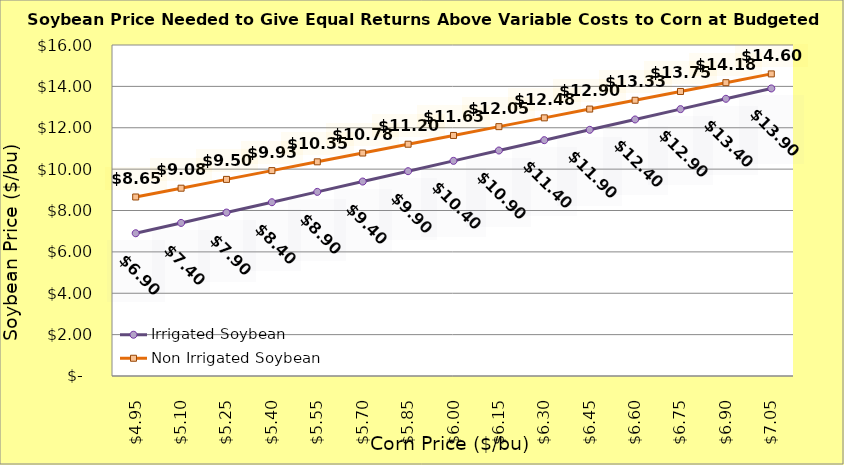
| Category | Irrigated Soybean | Non Irrigated Soybean |
|---|---|---|
| 4.9499999999999975 | 6.9 | 8.653 |
| 5.099999999999998 | 7.4 | 9.078 |
| 5.249999999999998 | 7.9 | 9.503 |
| 5.399999999999999 | 8.4 | 9.928 |
| 5.549999999999999 | 8.9 | 10.353 |
| 5.699999999999999 | 9.4 | 10.778 |
| 5.85 | 9.9 | 11.203 |
| 6.0 | 10.4 | 11.628 |
| 6.15 | 10.9 | 12.053 |
| 6.300000000000001 | 11.4 | 12.478 |
| 6.450000000000001 | 11.9 | 12.903 |
| 6.600000000000001 | 12.4 | 13.328 |
| 6.750000000000002 | 12.9 | 13.753 |
| 6.900000000000002 | 13.4 | 14.178 |
| 7.0500000000000025 | 13.9 | 14.603 |